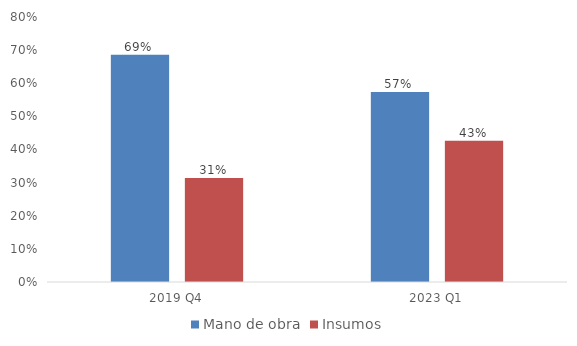
| Category | Mano de obra | Insumos |
|---|---|---|
| 2019 Q4 | 0.686 | 0.314 |
| 2023 Q1 | 0.574 | 0.426 |